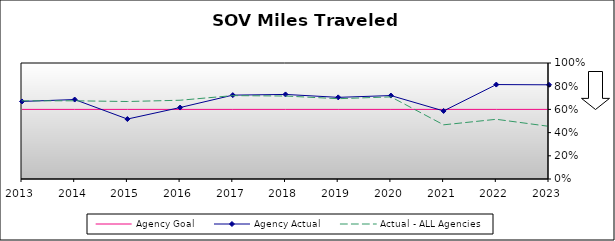
| Category | Agency Goal | Agency Actual | Actual - ALL Agencies |
|---|---|---|---|
| 2013.0 | 0.6 | 0.668 | 0.674 |
| 2014.0 | 0.6 | 0.685 | 0.674 |
| 2015.0 | 0.6 | 0.517 | 0.668 |
| 2016.0 | 0.6 | 0.616 | 0.679 |
| 2017.0 | 0.6 | 0.723 | 0.719 |
| 2018.0 | 0.6 | 0.729 | 0.715 |
| 2019.0 | 0.6 | 0.704 | 0.692 |
| 2020.0 | 0.6 | 0.719 | 0.708 |
| 2021.0 | 0.6 | 0.587 | 0.467 |
| 2022.0 | 0.6 | 0.814 | 0.515 |
| 2023.0 | 0.6 | 0.812 | 0.454 |